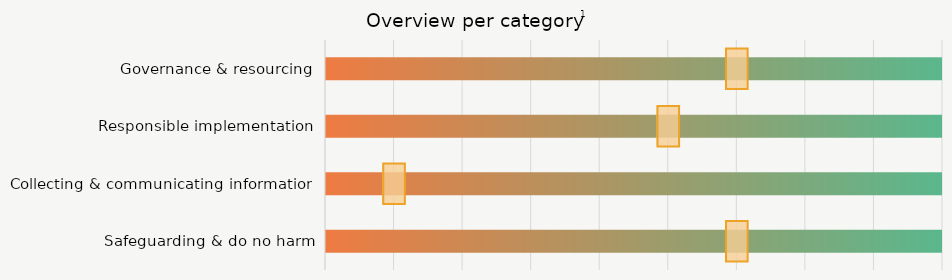
| Category | Max |
|---|---|
| Governance & resourcing | 9 |
| Responsible implementation | 9 |
| Collecting & communicating information | 9 |
| Safeguarding & do no harm | 9 |